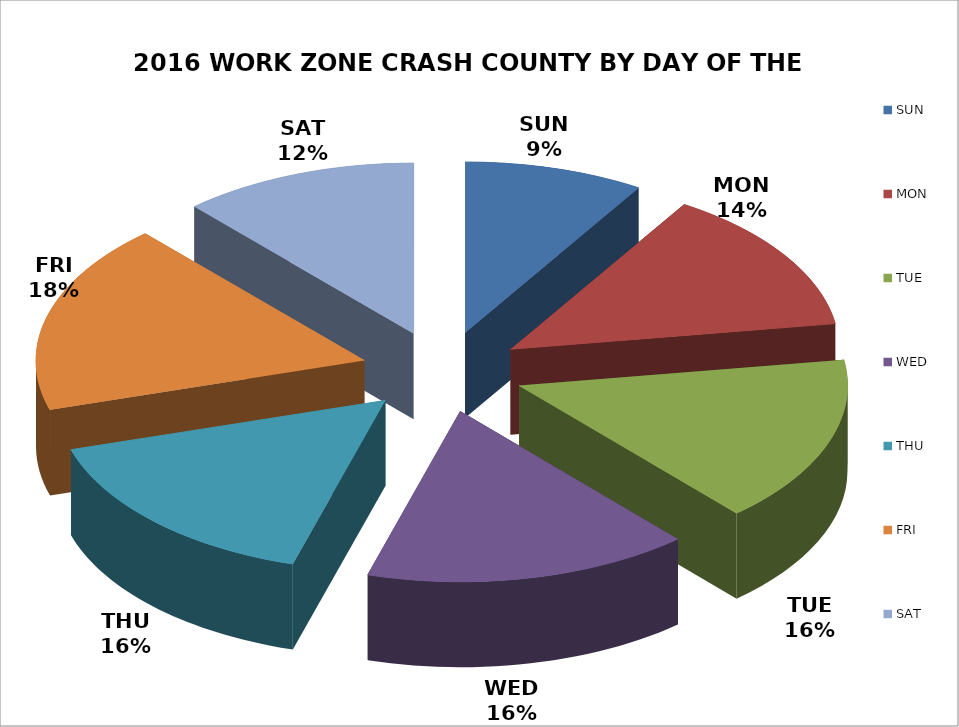
| Category | COUNT | % |
|---|---|---|
| SUN | 555 | 0.089 |
| MON | 861 | 0.137 |
| TUE | 995 | 0.159 |
| WED | 1007 | 0.161 |
| THU | 989 | 0.158 |
| FRI | 1130 | 0.18 |
| SAT | 729 | 0.116 |